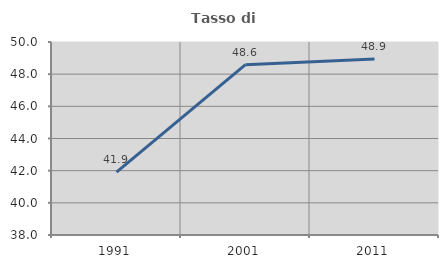
| Category | Tasso di occupazione   |
|---|---|
| 1991.0 | 41.907 |
| 2001.0 | 48.592 |
| 2011.0 | 48.941 |